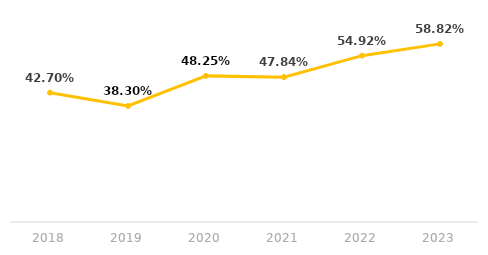
| Category | Series 0 |
|---|---|
| 2018.0 | 0.427 |
| 2019.0 | 0.383 |
| 2020.0 | 0.482 |
| 2021.0 | 0.478 |
| 2022.0 | 0.549 |
| 2023.0 | 0.588 |